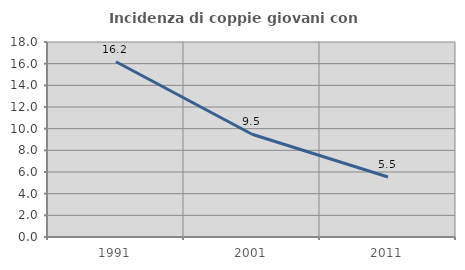
| Category | Incidenza di coppie giovani con figli |
|---|---|
| 1991.0 | 16.173 |
| 2001.0 | 9.487 |
| 2011.0 | 5.537 |